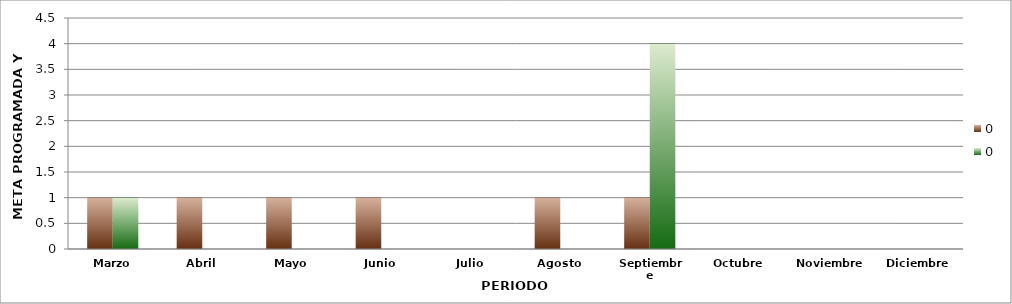
| Category | 0 |
|---|---|
| Marzo | 1 |
| Abril | 0 |
| Mayo | 0 |
| Junio | 0 |
| Julio | 0 |
| Agosto | 0 |
| Septiembre | 4 |
| Octubre | 0 |
| Noviembre | 0 |
| Diciembre | 0 |